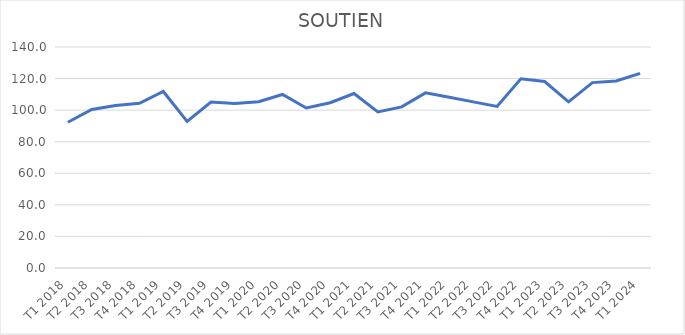
| Category | Series 0 |
|---|---|
| T1 2018 | 92.304 |
| T2 2018 | 100.419 |
| T3 2018 | 102.967 |
| T4 2018 | 104.31 |
| T1 2019 | 111.823 |
| T2 2019 | 92.921 |
| T3 2019 | 105.095 |
| T4 2019 | 104.271 |
| T1 2020 | 105.339 |
| T2 2020 | 109.944 |
| T3 2020 | 101.374 |
| T4 2020 | 104.693 |
| T1 2021 | 110.499 |
| T2 2021 | 98.837 |
| T3 2021 | 102.089 |
| T4 2021 | 110.948 |
| T1 2022 | 108.191 |
| T2 2022 | 105.254 |
| T3 2022 | 102.367 |
| T4 2022 | 119.899 |
| T1 2023 | 118.152 |
| T2 2023 | 105.254 |
| T3 2023 | 117.437 |
| T4 2023 | 118.44 |
| T1 2024 | 123.293 |